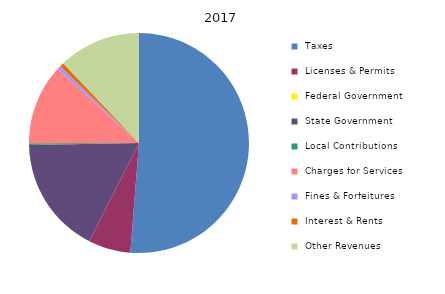
| Category | 2017 |
|---|---|
| Taxes | 10227120 |
|  Licenses & Permits  | 1237369 |
|  Federal Government  | 0 |
|  State Government  | 3438616 |
|  Local Contributions  | 54565 |
|  Charges for Services  | 2356483 |
|  Fines & Forfeitures  | 103692 |
|  Interest & Rents  | 117444 |
|  Other Revenues  | 2417076 |